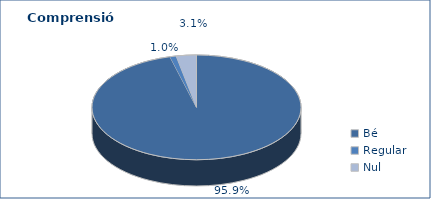
| Category | Series 0 |
|---|---|
| Bé | 5368 |
| Regular | 54 |
| Nul | 175 |